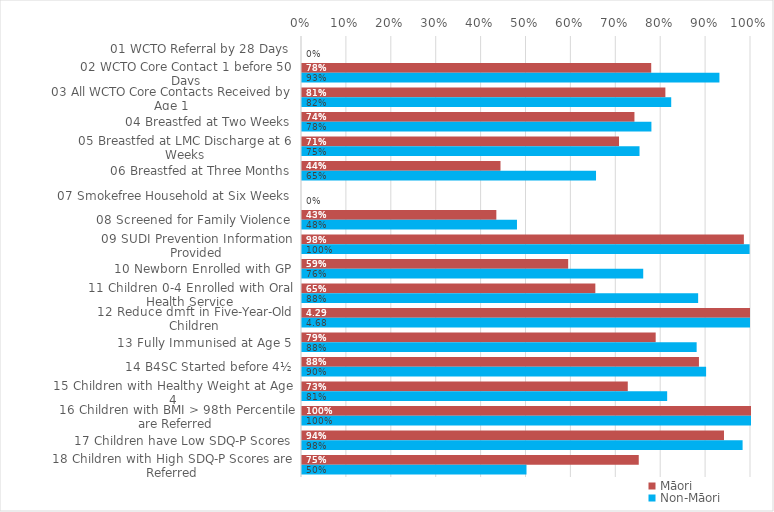
| Category | Māori | Non-Māori |
|---|---|---|
| 01 WCTO Referral by 28 Days | 0 | 0 |
| 02 WCTO Core Contact 1 before 50 Days | 0.778 | 0.93 |
| 03 All WCTO Core Contacts Received by Age 1 | 0.809 | 0.822 |
| 04 Breastfed at Two Weeks | 0.74 | 0.778 |
| 05 Breastfed at LMC Discharge at 6 Weeks | 0.706 | 0.752 |
| 06 Breastfed at Three Months | 0.442 | 0.655 |
| 07 Smokefree Household at Six Weeks | 0 | 0 |
| 08 Screened for Family Violence | 0.433 | 0.479 |
| 09 SUDI Prevention Information Provided | 0.984 | 0.997 |
| 10 Newborn Enrolled with GP | 0.593 | 0.76 |
| 11 Children 0-4 Enrolled with Oral Health Service | 0.653 | 0.882 |
| 12 Reduce dmft in Five-Year-Old Children | 4.292 | 4.68 |
| 13 Fully Immunised at Age 5 | 0.788 | 0.879 |
| 14 B4SC Started before 4½ | 0.884 | 0.9 |
| 15 Children with Healthy Weight at Age 4 | 0.726 | 0.813 |
| 16 Children with BMI > 98th Percentile are Referred | 1 | 1 |
| 17 Children have Low SDQ-P Scores | 0.94 | 0.981 |
| 18 Children with High SDQ-P Scores are Referred | 0.75 | 0.5 |